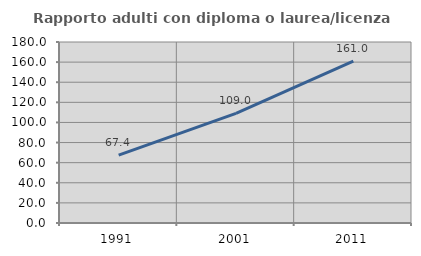
| Category | Rapporto adulti con diploma o laurea/licenza media  |
|---|---|
| 1991.0 | 67.431 |
| 2001.0 | 108.974 |
| 2011.0 | 161.024 |